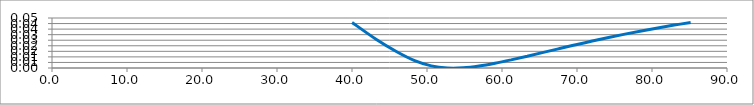
| Category | Series 0 |
|---|---|
| 40.0106 | 0.041 |
| 43.254 | 0.026 |
| 45.9668 | 0.015 |
| 48.3555 | 0.007 |
| 50.5711 | 0.002 |
| 52.7102 | 0 |
| 54.8257 | 0 |
| 56.9426 | 0.002 |
| 59.07 | 0.004 |
| 61.2095 | 0.007 |
| 63.3598 | 0.011 |
| 65.5186 | 0.014 |
| 67.684 | 0.018 |
| 69.8543 | 0.021 |
| 72.0289 | 0.024 |
| 74.2071 | 0.027 |
| 76.3888 | 0.03 |
| 78.5741 | 0.033 |
| 80.7633 | 0.036 |
| 82.9567 | 0.039 |
| 85.1546 | 0.041 |